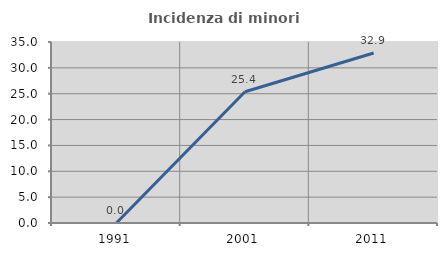
| Category | Incidenza di minori stranieri |
|---|---|
| 1991.0 | 0 |
| 2001.0 | 25.373 |
| 2011.0 | 32.867 |